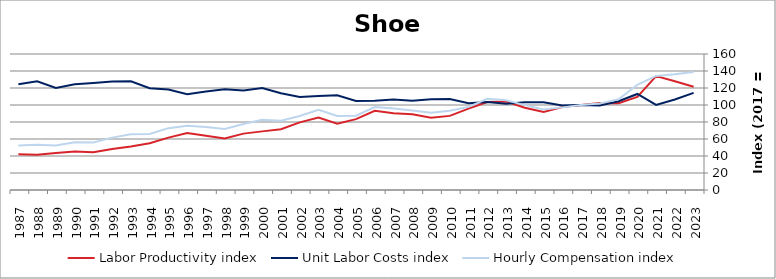
| Category | Labor Productivity index | Unit Labor Costs index | Hourly Compensation index |
|---|---|---|---|
| 2023.0 | 121.498 | 114.297 | 138.868 |
| 2022.0 | 128.007 | 106.458 | 136.275 |
| 2021.0 | 134.029 | 100.122 | 134.192 |
| 2020.0 | 109.569 | 112.976 | 123.786 |
| 2019.0 | 102.207 | 104.407 | 106.711 |
| 2018.0 | 102.462 | 99.323 | 101.768 |
| 2017.0 | 100 | 100 | 100 |
| 2016.0 | 97.638 | 99.559 | 97.207 |
| 2015.0 | 91.68 | 103.25 | 94.66 |
| 2014.0 | 96.843 | 103.111 | 99.856 |
| 2013.0 | 104.065 | 101.34 | 105.46 |
| 2012.0 | 103.552 | 103.537 | 107.215 |
| 2011.0 | 95.685 | 102.195 | 97.785 |
| 2010.0 | 87.193 | 106.953 | 93.256 |
| 2009.0 | 85.107 | 106.818 | 90.909 |
| 2008.0 | 89.121 | 105.08 | 93.649 |
| 2007.0 | 90.175 | 106.337 | 95.89 |
| 2006.0 | 93.088 | 104.878 | 97.629 |
| 2005.0 | 83.396 | 104.717 | 87.33 |
| 2004.0 | 78.089 | 111.403 | 86.994 |
| 2003.0 | 85.153 | 110.668 | 94.237 |
| 2002.0 | 79.583 | 109.435 | 87.093 |
| 2001.0 | 71.508 | 113.855 | 81.415 |
| 2000.0 | 68.976 | 119.979 | 82.757 |
| 1999.0 | 66.329 | 116.969 | 77.585 |
| 1998.0 | 60.733 | 118.401 | 71.909 |
| 1997.0 | 63.906 | 115.889 | 74.06 |
| 1996.0 | 67.036 | 112.693 | 75.545 |
| 1995.0 | 61.589 | 118.141 | 72.761 |
| 1994.0 | 55.054 | 119.684 | 65.891 |
| 1993.0 | 51.201 | 127.83 | 65.45 |
| 1992.0 | 48.326 | 127.515 | 61.622 |
| 1991.0 | 44.313 | 125.916 | 55.797 |
| 1990.0 | 45.206 | 124.378 | 56.226 |
| 1989.0 | 43.671 | 120.065 | 52.433 |
| 1988.0 | 41.562 | 127.944 | 53.176 |
| 1987.0 | 42.072 | 124.304 | 52.297 |